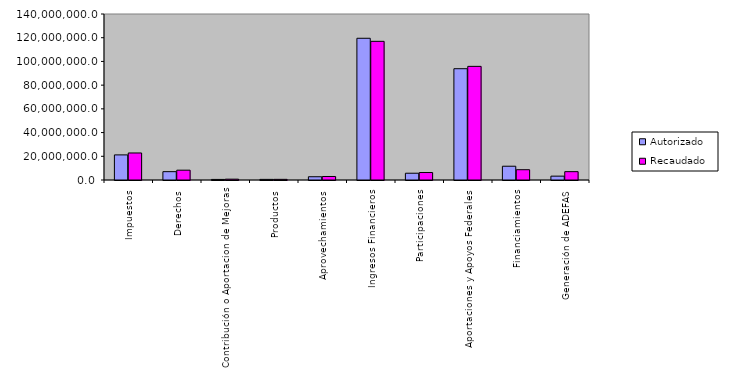
| Category | Autorizado | Recaudado |
|---|---|---|
| 0 | 21168954.6 | 22785928.8 |
| 1 | 7025502.5 | 8282970.4 |
| 2 | 481215.9 | 699933.2 |
| 3 | 523505.1 | 542812.8 |
| 4 | 2742104.7 | 2959492.6 |
| 5 | 119522887.5 | 116950894.9 |
| 6 | 5716826.6 | 6311647.1 |
| 7 | 93864085.8 | 95835419.3 |
| 8 | 11609817.9 | 8677022 |
| 9 | 3243691 | 7032958.1 |